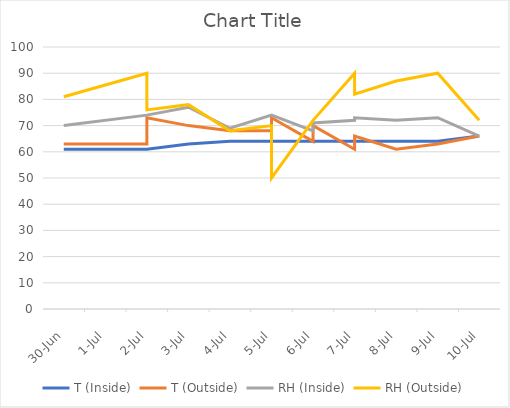
| Category | T (Inside) | T (Outside) | RH (Inside) | RH (Outside) |
|---|---|---|---|---|
| 2017-06-30 | 61 | 63 | 70 | 81 |
| 2017-07-02 | 61 | 63 | 74 | 90 |
| 2017-07-02 | 61 | 73 | 74 | 76 |
| 2017-07-03 | 63 | 70 | 77 | 78 |
| 2017-07-04 | 64 | 68 | 69 | 68 |
| 2017-07-05 | 64 | 68 | 74 | 70 |
| 2017-07-05 | 64 | 73 | 74 | 50 |
| 2017-07-06 | 64 | 64 | 68 | 72 |
| 2017-07-06 | 64 | 70 | 71 | 72 |
| 2017-07-07 | 64 | 61 | 72 | 90 |
| 2017-07-07 | 64 | 66 | 73 | 82 |
| 2017-07-08 | 64 | 61 | 72 | 87 |
| 2017-07-09 | 64 | 63 | 73 | 90 |
| 2017-07-10 | 66 | 66 | 66 | 72 |